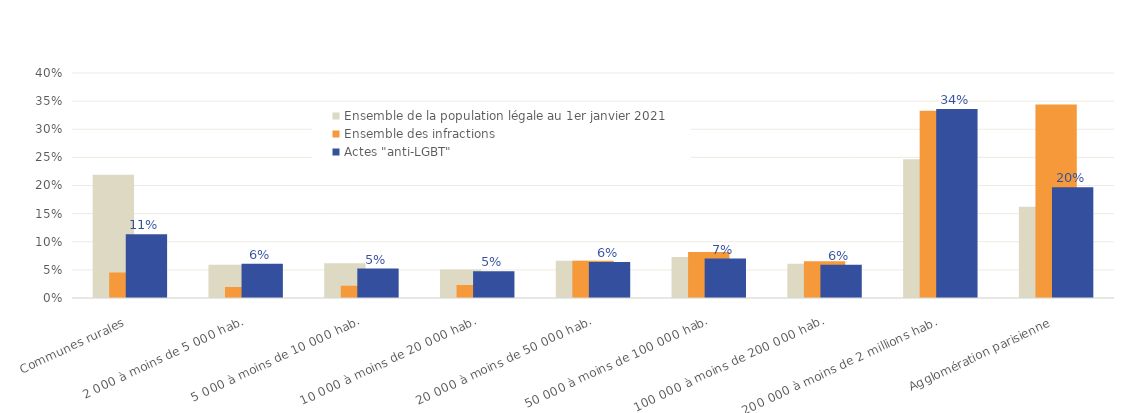
| Category | Ensemble de la population légale au 1er janvier 2021 | Ensemble des infractions | Actes "anti-LGBT" |
|---|---|---|---|
| Communes rurales | 0.219 | 0.045 | 0.113 |
| 2 000 à moins de 5 000 hab. | 0.059 | 0.019 | 0.061 |
| 5 000 à moins de 10 000 hab. | 0.062 | 0.022 | 0.052 |
| 10 000 à moins de 20 000 hab. | 0.051 | 0.023 | 0.048 |
| 20 000 à moins de 50 000 hab. | 0.066 | 0.066 | 0.064 |
| 50 000 à moins de 100 000 hab. | 0.073 | 0.082 | 0.07 |
| 100 000 à moins de 200 000 hab. | 0.061 | 0.066 | 0.059 |
| 200 000 à moins de 2 millions hab. | 0.247 | 0.333 | 0.336 |
| Agglomération parisienne | 0.162 | 0.344 | 0.197 |